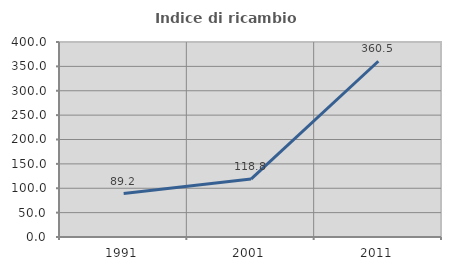
| Category | Indice di ricambio occupazionale  |
|---|---|
| 1991.0 | 89.197 |
| 2001.0 | 118.841 |
| 2011.0 | 360.465 |